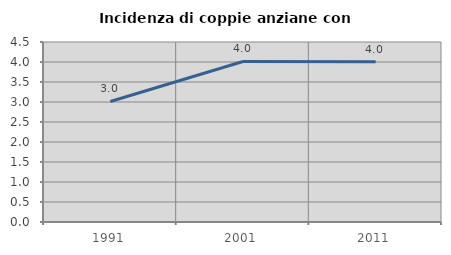
| Category | Incidenza di coppie anziane con figli |
|---|---|
| 1991.0 | 3.014 |
| 2001.0 | 4.013 |
| 2011.0 | 4.004 |